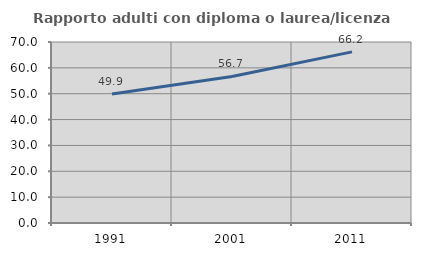
| Category | Rapporto adulti con diploma o laurea/licenza media  |
|---|---|
| 1991.0 | 49.866 |
| 2001.0 | 56.66 |
| 2011.0 | 66.182 |